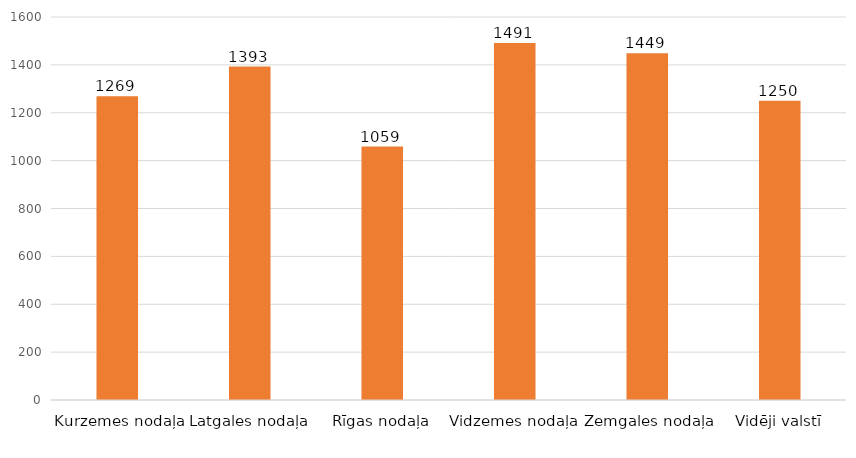
| Category | Series 0 |
|---|---|
| Kurzemes nodaļa | 1269 |
| Latgales nodaļa | 1393 |
| Rīgas nodaļa | 1059 |
| Vidzemes nodaļa | 1491 |
| Zemgales nodaļa | 1449 |
| Vidēji valstī | 1250 |